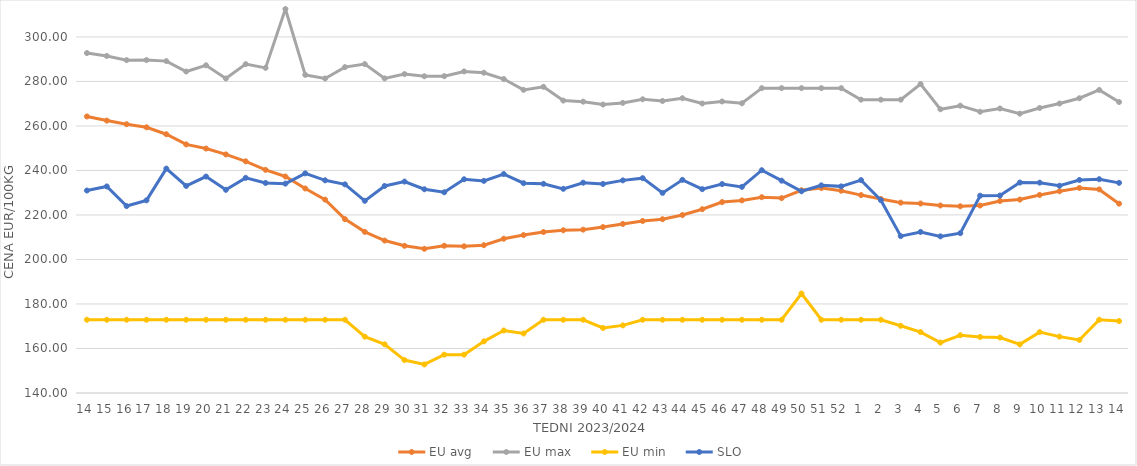
| Category | EU avg | EU max | EU min | SLO |
|---|---|---|---|---|
| 14.0 | 264.262 | 292.763 | 172.91 | 230.99 |
| 15.0 | 262.411 | 291.46 | 172.91 | 232.82 |
| 16.0 | 260.77 | 289.56 | 172.91 | 224 |
| 17.0 | 259.395 | 289.61 | 172.91 | 226.57 |
| 18.0 | 256.275 | 289.13 | 172.91 | 240.83 |
| 19.0 | 251.716 | 284.45 | 172.91 | 233.05 |
| 20.0 | 249.836 | 287.26 | 172.91 | 237.25 |
| 21.0 | 247.212 | 281.33 | 172.91 | 231.3 |
| 22.0 | 244.103 | 287.77 | 172.91 | 236.67 |
| 23.0 | 240.279 | 286.1 | 172.91 | 234.39 |
| 24.0 | 237.289 | 312.54 | 172.91 | 234.08 |
| 25.0 | 231.895 | 282.95 | 172.91 | 238.69 |
| 26.0 | 226.903 | 281.34 | 172.91 | 235.57 |
| 27.0 | 218.126 | 286.43 | 172.91 | 233.75 |
| 28.0 | 212.406 | 287.8 | 165.32 | 226.35 |
| 29.0 | 208.504 | 281.37 | 161.87 | 233.03 |
| 30.0 | 206.149 | 283.3 | 154.8 | 235 |
| 31.0 | 204.79 | 282.32 | 152.83 | 231.55 |
| 32.0 | 206.16 | 282.36 | 157.23 | 230.2 |
| 33.0 | 205.917 | 284.5 | 157.23 | 236.04 |
| 34.0 | 206.436 | 283.9 | 163.21 | 235.32 |
| 35.0 | 209.326 | 281.09 | 168.085 | 238.39 |
| 36.0 | 210.957 | 276.21 | 166.745 | 234.27 |
| 37.0 | 212.325 | 277.59 | 172.91 | 234 |
| 38.0 | 213.132 | 271.4 | 172.91 | 231.74 |
| 39.0 | 213.398 | 270.91 | 172.91 | 234.5 |
| 40.0 | 214.548 | 269.62 | 169.209 | 233.92 |
| 41.0 | 215.966 | 270.36 | 170.387 | 235.54 |
| 42.0 | 217.294 | 271.99 | 172.91 | 236.54 |
| 43.0 | 218.091 | 271.22 | 172.91 | 229.92 |
| 44.0 | 219.965 | 272.45 | 172.91 | 235.77 |
| 45.0 | 222.584 | 270.09 | 172.91 | 231.6 |
| 46.0 | 225.795 | 270.99 | 172.91 | 233.89 |
| 47.0 | 226.547 | 270.18 | 172.91 | 232.62 |
| 48.0 | 227.993 | 276.99 | 172.91 | 240.11 |
| 49.0 | 227.575 | 276.99 | 172.91 | 235.41 |
| 50.0 | 231.099 | 276.99 | 184.72 | 230.65 |
| 51.0 | 232.088 | 276.99 | 172.91 | 233.3 |
| 52.0 | 230.884 | 276.99 | 172.91 | 232.85 |
| 1.0 | 228.928 | 271.8 | 172.91 | 235.66 |
| 2.0 | 227.213 | 271.8 | 172.91 | 226.65 |
| 3.0 | 225.533 | 271.8 | 170.2 | 210.5 |
| 4.0 | 225.142 | 278.81 | 167.37 | 212.37 |
| 5.0 | 224.262 | 267.49 | 162.66 | 210.38 |
| 6.0 | 223.902 | 269.11 | 165.95 | 211.82 |
| 7.0 | 224.231 | 266.38 | 165.18 | 228.66 |
| 8.0 | 226.285 | 267.85 | 164.92 | 228.73 |
| 9.0 | 226.925 | 265.51 | 161.84 | 234.57 |
| 10.0 | 228.992 | 268.09 | 167.35 | 234.52 |
| 11.0 | 230.655 | 270.07 | 165.34 | 233.13 |
| 12.0 | 232.129 | 272.46 | 163.83 | 235.73 |
| 13.0 | 231.483 | 276.17 | 172.91 | 236.07 |
| 14.0 | 225.075 | 270.75 | 172.32 | 234.43 |